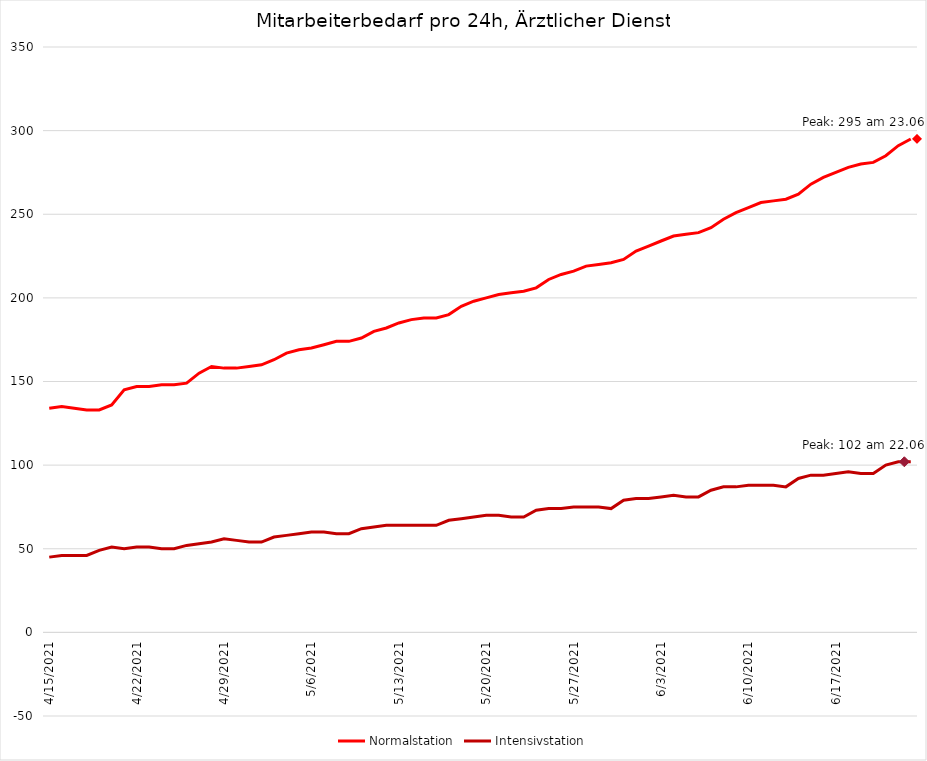
| Category | Normalstation | Intensivstation |
|---|---|---|
| 4/15/21 | 134 | 45 |
| 4/16/21 | 135 | 46 |
| 4/17/21 | 134 | 46 |
| 4/18/21 | 133 | 46 |
| 4/19/21 | 133 | 49 |
| 4/20/21 | 136 | 51 |
| 4/21/21 | 145 | 50 |
| 4/22/21 | 147 | 51 |
| 4/23/21 | 147 | 51 |
| 4/24/21 | 148 | 50 |
| 4/25/21 | 148 | 50 |
| 4/26/21 | 149 | 52 |
| 4/27/21 | 155 | 53 |
| 4/28/21 | 159 | 54 |
| 4/29/21 | 158 | 56 |
| 4/30/21 | 158 | 55 |
| 5/1/21 | 159 | 54 |
| 5/2/21 | 160 | 54 |
| 5/3/21 | 163 | 57 |
| 5/4/21 | 167 | 58 |
| 5/5/21 | 169 | 59 |
| 5/6/21 | 170 | 60 |
| 5/7/21 | 172 | 60 |
| 5/8/21 | 174 | 59 |
| 5/9/21 | 174 | 59 |
| 5/10/21 | 176 | 62 |
| 5/11/21 | 180 | 63 |
| 5/12/21 | 182 | 64 |
| 5/13/21 | 185 | 64 |
| 5/14/21 | 187 | 64 |
| 5/15/21 | 188 | 64 |
| 5/16/21 | 188 | 64 |
| 5/17/21 | 190 | 67 |
| 5/18/21 | 195 | 68 |
| 5/19/21 | 198 | 69 |
| 5/20/21 | 200 | 70 |
| 5/21/21 | 202 | 70 |
| 5/22/21 | 203 | 69 |
| 5/23/21 | 204 | 69 |
| 5/24/21 | 206 | 73 |
| 5/25/21 | 211 | 74 |
| 5/26/21 | 214 | 74 |
| 5/27/21 | 216 | 75 |
| 5/28/21 | 219 | 75 |
| 5/29/21 | 220 | 75 |
| 5/30/21 | 221 | 74 |
| 5/31/21 | 223 | 79 |
| 6/1/21 | 228 | 80 |
| 6/2/21 | 231 | 80 |
| 6/3/21 | 234 | 81 |
| 6/4/21 | 237 | 82 |
| 6/5/21 | 238 | 81 |
| 6/6/21 | 239 | 81 |
| 6/7/21 | 242 | 85 |
| 6/8/21 | 247 | 87 |
| 6/9/21 | 251 | 87 |
| 6/10/21 | 254 | 88 |
| 6/11/21 | 257 | 88 |
| 6/12/21 | 258 | 88 |
| 6/13/21 | 259 | 87 |
| 6/14/21 | 262 | 92 |
| 6/15/21 | 268 | 94 |
| 6/16/21 | 272 | 94 |
| 6/17/21 | 275 | 95 |
| 6/18/21 | 278 | 96 |
| 6/19/21 | 280 | 95 |
| 6/20/21 | 281 | 95 |
| 6/21/21 | 285 | 100 |
| 6/22/21 | 291 | 102 |
| 6/23/21 | 295 | 102 |